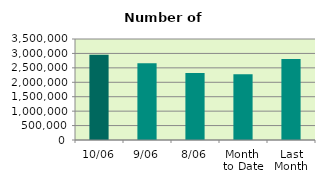
| Category | Series 0 |
|---|---|
| 10/06 | 2954944 |
| 9/06 | 2656328 |
| 8/06 | 2321742 |
| Month 
to Date | 2277387 |
| Last
Month | 2808947.182 |